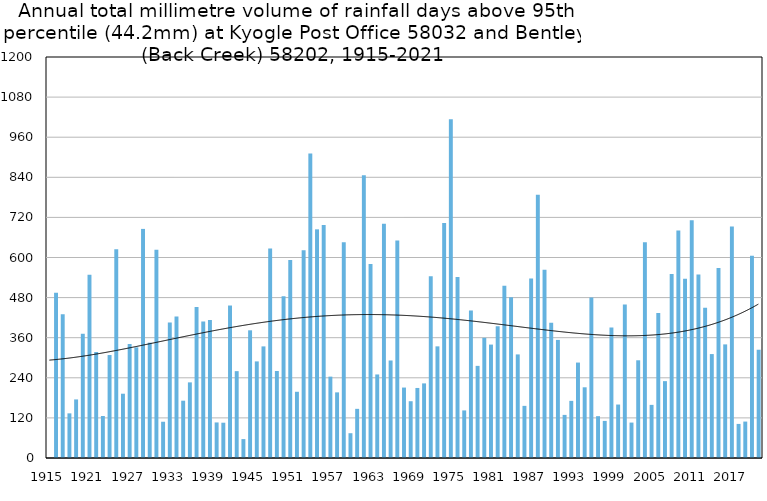
| Category | Annual total mm in days above 95th percentile |
|---|---|
| 1915 | 0 |
| 1916 | 494.3 |
| 1917 | 430.1 |
| 1918 | 133.6 |
| 1919 | 175.3 |
| 1920 | 371.8 |
| 1921 | 548.4 |
| 1922 | 317.3 |
| 1923 | 125.7 |
| 1924 | 308.1 |
| 1925 | 624.5 |
| 1926 | 192.4 |
| 1927 | 341.1 |
| 1928 | 331.1 |
| 1929 | 685.6 |
| 1930 | 345.2 |
| 1931 | 623.2 |
| 1932 | 108.5 |
| 1933 | 405.6 |
| 1934 | 423.1 |
| 1935 | 171.5 |
| 1936 | 226.3 |
| 1937 | 451.7 |
| 1938 | 408.7 |
| 1939 | 413 |
| 1940 | 106.4 |
| 1941 | 105.6 |
| 1942 | 456.3 |
| 1943 | 259.9 |
| 1944 | 56.6 |
| 1945 | 382.1 |
| 1946 | 289.1 |
| 1947 | 334 |
| 1948 | 627.3 |
| 1949 | 260.3 |
| 1950 | 483.9 |
| 1951 | 592.6 |
| 1952 | 198.2 |
| 1953 | 622 |
| 1954 | 911.2 |
| 1955 | 684.3 |
| 1956 | 697.1 |
| 1957 | 243.5 |
| 1958 | 196.4 |
| 1959 | 645.7 |
| 1960 | 74.2 |
| 1961 | 147.1 |
| 1962 | 846.4 |
| 1963 | 580.6 |
| 1964 | 250 |
| 1965 | 701 |
| 1966 | 291.8 |
| 1967 | 650.7 |
| 1968 | 210.8 |
| 1969 | 169.9 |
| 1970 | 209.6 |
| 1971 | 223.3 |
| 1972 | 544 |
| 1973 | 334.1 |
| 1974 | 703.2 |
| 1975 | 1013.8 |
| 1976 | 541.3 |
| 1977 | 142.4 |
| 1978 | 441.2 |
| 1979 | 275.7 |
| 1980 | 359.6 |
| 1981 | 339.4 |
| 1982 | 394.2 |
| 1983 | 515.2 |
| 1984 | 481 |
| 1985 | 310 |
| 1986 | 156 |
| 1987 | 537 |
| 1988 | 788 |
| 1989 | 563 |
| 1990 | 405 |
| 1991 | 353.4 |
| 1992 | 129 |
| 1993 | 171 |
| 1994 | 285.6 |
| 1995 | 211.6 |
| 1996 | 480 |
| 1997 | 125.2 |
| 1998 | 111 |
| 1999 | 390.2 |
| 2000 | 160 |
| 2001 | 459.5 |
| 2002 | 106 |
| 2003 | 292.4 |
| 2004 | 645.6 |
| 2005 | 159 |
| 2006 | 433.9 |
| 2007 | 230 |
| 2008 | 550.6 |
| 2009 | 680.6 |
| 2010 | 536.6 |
| 2011 | 711.6 |
| 2012 | 549 |
| 2013 | 449.4 |
| 2014 | 311 |
| 2015 | 568.6 |
| 2016 | 340 |
| 2017 | 693 |
| 2018 | 102 |
| 2019 | 109 |
| 2020 | 605 |
| 2021 | 324 |